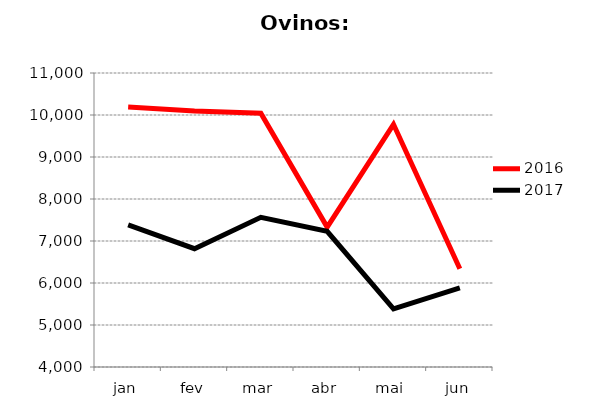
| Category | 2016 | 2017 |
|---|---|---|
| jan | 10193 | 7385 |
| fev | 10098 | 6817 |
| mar | 10042 | 7565 |
| abr | 7331 | 7231 |
| mai | 9778 | 5383 |
| jun | 6339 | 5883 |